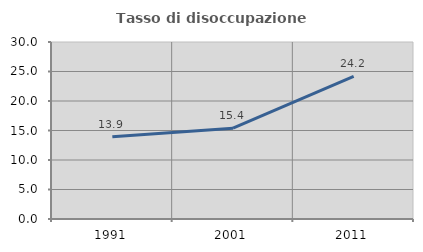
| Category | Tasso di disoccupazione giovanile  |
|---|---|
| 1991.0 | 13.928 |
| 2001.0 | 15.385 |
| 2011.0 | 24.194 |